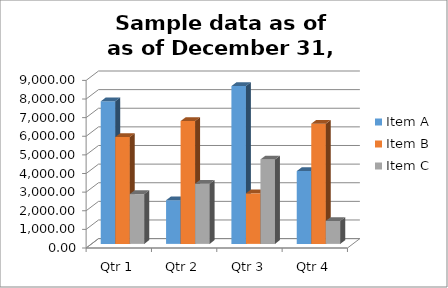
| Category | Item A | Item B | Item C |
|---|---|---|---|
| Qtr 1 | 7654.98 | 5736.98 | 2674.18 |
| Qtr 2 | 2345.87 | 6593.45 | 3234.23 |
| Qtr 3 | 8473.23 | 2713.47 | 4534.23 |
| Qtr 4 | 3908.95 | 6453.23 | 1234.56 |